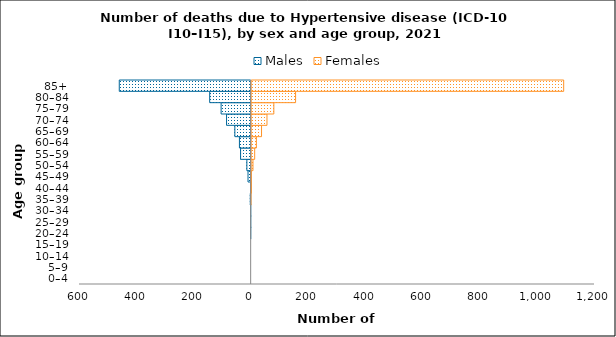
| Category | Males | Females |
|---|---|---|
| 0–4 | 0 | 0 |
| 5–9 | 0 | 0 |
| 10–14 | 0 | 0 |
| 15–19 | 0 | 0 |
| 20–24 | -1 | 0 |
| 25–29 | -1 | 0 |
| 30–34 | -1 | 0 |
| 35–39 | -3 | 1 |
| 40–44 | -2 | 2 |
| 45–49 | -11 | 2 |
| 50–54 | -15 | 8 |
| 55–59 | -37 | 14 |
| 60–64 | -41 | 20 |
| 65–69 | -57 | 38 |
| 70–74 | -86 | 57 |
| 75–79 | -105 | 81 |
| 80–84 | -145 | 157 |
| 85+ | -461 | 1094 |